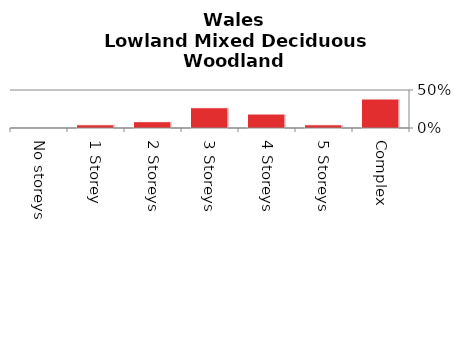
| Category | Lowland Mixed Deciduous Woodland |
|---|---|
| No storeys | 0 |
| 1 Storey | 0.042 |
| 2 Storeys | 0.083 |
| 3 Storeys | 0.267 |
| 4 Storeys | 0.184 |
| 5 Storeys | 0.042 |
| Complex | 0.382 |